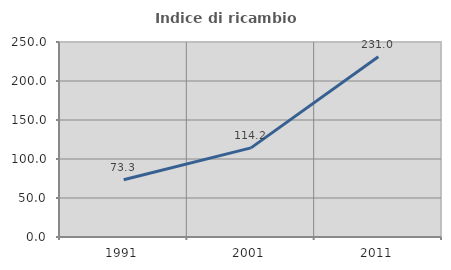
| Category | Indice di ricambio occupazionale  |
|---|---|
| 1991.0 | 73.333 |
| 2001.0 | 114.232 |
| 2011.0 | 230.973 |